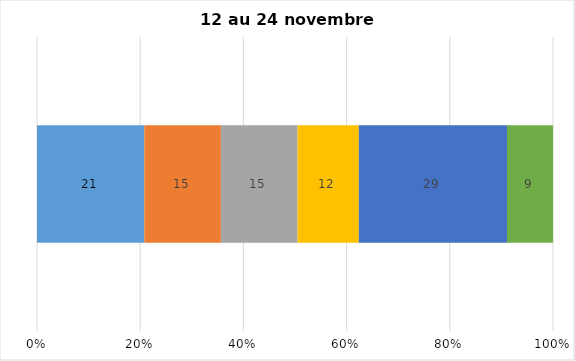
| Category | Plusieurs fois par jour | Une fois par jour | Quelques fois par semaine   | Une fois par semaine ou moins   |  Jamais   |  Je n’utilise pas les médias sociaux |
|---|---|---|---|---|---|---|
| 0 | 21 | 15 | 15 | 12 | 29 | 9 |